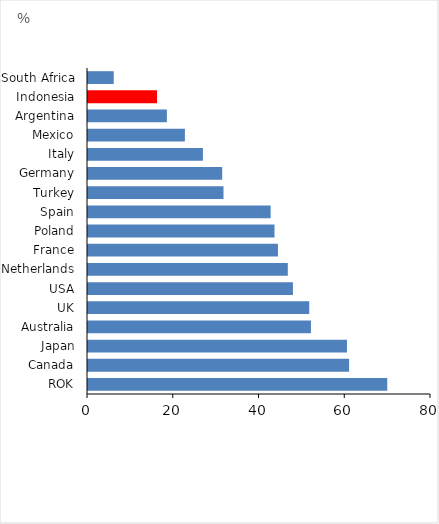
| Category | Series 0 |
|---|---|
| ROK | 69.8 |
| Canada | 60.9 |
| Japan | 60.4 |
| Australia | 52 |
| UK | 51.6 |
| USA | 47.8 |
| Netherlands | 46.6 |
| France | 44.3 |
| Poland | 43.5 |
| Spain | 42.6 |
| Turkey | 31.6 |
| Germany | 31.3 |
| Italy | 26.8 |
| Mexico | 22.6 |
| Argentina | 18.4 |
| Indonesia | 16.1 |
| South Africa | 6 |